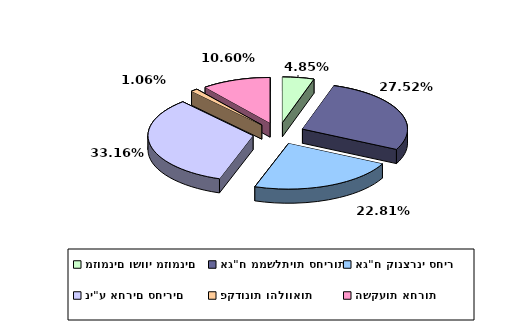
| Category | Series 0 |
|---|---|
| מזומנים ושווי מזומנים | 0.049 |
| אג"ח ממשלתיות סחירות | 0.275 |
| אג"ח קונצרני סחיר | 0.228 |
| ני"ע אחרים סחירים | 0.332 |
| פקדונות והלוואות | 0.011 |
| השקעות אחרות | 0.106 |